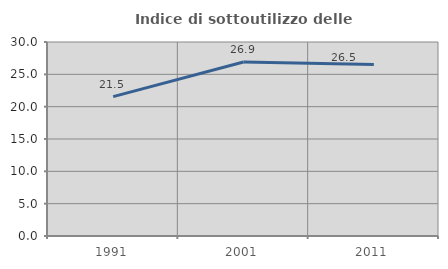
| Category | Indice di sottoutilizzo delle abitazioni  |
|---|---|
| 1991.0 | 21.549 |
| 2001.0 | 26.902 |
| 2011.0 | 26.512 |